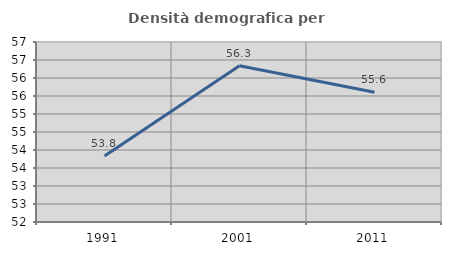
| Category | Densità demografica |
|---|---|
| 1991.0 | 53.835 |
| 2001.0 | 56.342 |
| 2011.0 | 55.605 |